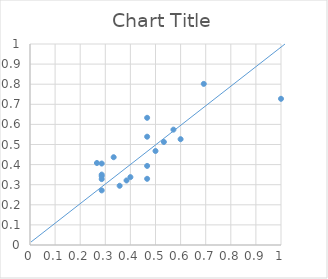
| Category | Series 0 |
|---|---|
| 0.2857142857142857 | 0.328 |
| 0.4666666666666667 | 0.539 |
| 0.38461538461538464 | 0.321 |
| 0.2857142857142857 | 0.405 |
| 0.4666666666666667 | 0.329 |
| 0.4666666666666667 | 0.633 |
| 0.4 | 0.338 |
| 0.5 | 0.468 |
| 0.6 | 0.526 |
| 1.0 | 0.727 |
| 0.6923076923076923 | 0.802 |
| 0.5333333333333333 | 0.513 |
| 0.35714285714285715 | 0.295 |
| 0.2857142857142857 | 0.272 |
| 0.4666666666666667 | 0.393 |
| 0.26666666666666666 | 0.408 |
| 0.5714285714285714 | 0.574 |
| 0.2857142857142857 | 0.35 |
| 0.2857142857142857 | 0.342 |
| 0.3333333333333333 | 0.437 |